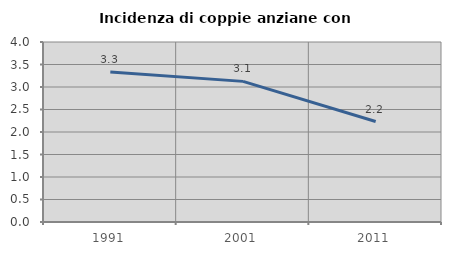
| Category | Incidenza di coppie anziane con figli |
|---|---|
| 1991.0 | 3.333 |
| 2001.0 | 3.125 |
| 2011.0 | 2.232 |